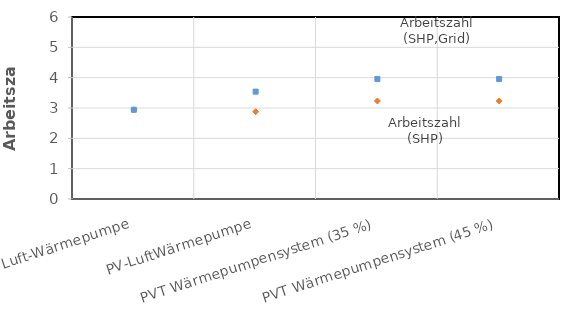
| Category | Arbeitszahl (SHP) | Arbeitszahl (SHP,Grid) |
|---|---|---|
| Luft-Wärmepumpe | 2.942 | 2.942 |
| PV-LuftWärmepumpe | 2.878 | 3.54 |
| PVT Wärmepumpensystem (35 %) | 3.231 | 3.958 |
| PVT Wärmepumpensystem (45 %) | 3.231 | 3.958 |